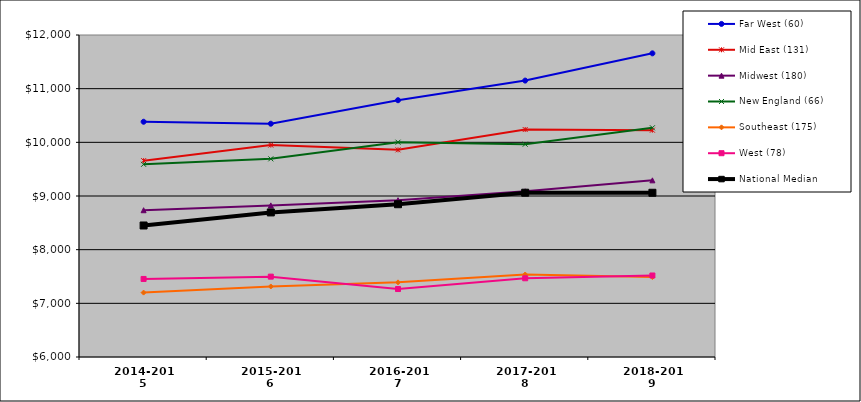
| Category | Far West (60) | Mid East (131) | Midwest (180) | New England (66) | Southeast (175) | West (78) | National Median |
|---|---|---|---|---|---|---|---|
| 2014-2015 | 10383.474 | 9658.89 | 8734.825 | 9590.538 | 7199.882 | 7454.534 | 8450.558 |
| 2015-2016 | 10346.961 | 9948.608 | 8825.254 | 9692.23 | 7314.245 | 7497.462 | 8693.909 |
| 2016-2017 | 10784.457 | 9859.955 | 8922.15 | 10002.455 | 7391.05 | 7266.428 | 8846.742 |
| 2017-2018 | 11150.547 | 10238.472 | 9087.467 | 9964.623 | 7537.022 | 7466.982 | 9061.41 |
| 2018-2019 | 11658.206 | 10226.594 | 9291.786 | 10271.004 | 7488.373 | 7518.898 | 9059.978 |